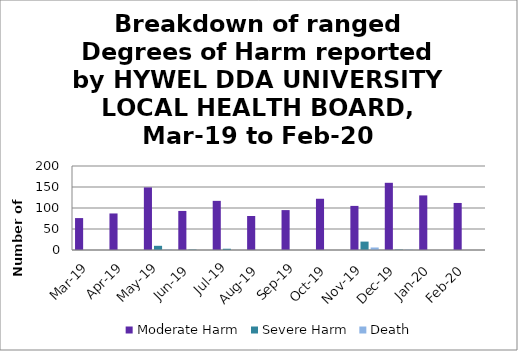
| Category | Moderate Harm | Severe Harm | Death |
|---|---|---|---|
| Mar-19 | 76 | 0 | 0 |
| Apr-19 | 87 | 0 | 0 |
| May-19 | 149 | 10 | 1 |
| Jun-19 | 93 | 1 | 0 |
| Jul-19 | 117 | 3 | 0 |
| Aug-19 | 81 | 0 | 0 |
| Sep-19 | 95 | 0 | 0 |
| Oct-19 | 122 | 0 | 0 |
| Nov-19 | 105 | 20 | 6 |
| Dec-19 | 160 | 1 | 1 |
| Jan-20 | 130 | 0 | 0 |
| Feb-20 | 112 | 0 | 0 |